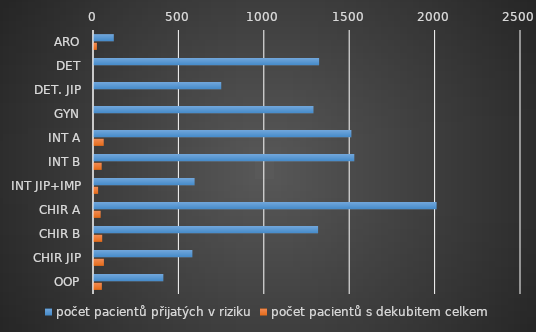
| Category | počet pacientů přijatých v riziku | počet pacientů s dekubitem celkem |
|---|---|---|
| ARO | 116 | 17 |
| DET | 1318 | 0 |
| DET. JIP | 745 | 0 |
| GYN | 1285 | 0 |
| INT A | 1507 | 57 |
| INT B | 1524 | 45 |
| INT JIP+IMP | 589 | 24 |
| CHIR A | 2006 | 39 |
| CHIR B | 1312 | 48 |
| CHIR JIP | 576 | 58 |
| OOP | 406 | 46 |